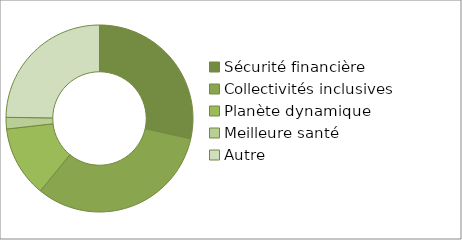
| Category | Series 0 |
|---|---|
| Sécurité financière | 0.285 |
| Collectivités inclusives | 0.324 |
| Planète dynamique | 0.123 |
| Meilleure santé | 0.02 |
| Autre | 0.248 |